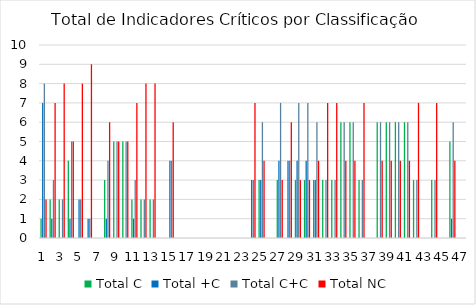
| Category | Total C | Total +C | Total C+C | Total NC |
|---|---|---|---|---|
| 0 | 1 | 7 | 8 | 2 |
| 1 | 2 | 1 | 3 | 7 |
| 2 | 2 | 0 | 2 | 8 |
| 3 | 4 | 1 | 5 | 5 |
| 4 | 0 | 2 | 2 | 8 |
| 5 | 0 | 1 | 1 | 9 |
| 6 | 0 | 0 | 0 | 0 |
| 7 | 3 | 1 | 4 | 6 |
| 8 | 5 | 0 | 5 | 5 |
| 9 | 5 | 0 | 5 | 5 |
| 10 | 2 | 1 | 3 | 7 |
| 11 | 2 | 0 | 2 | 8 |
| 12 | 2 | 0 | 2 | 8 |
| 13 | 0 | 0 | 0 | 0 |
| 14 | 0 | 4 | 4 | 6 |
| 15 | 0 | 0 | 0 | 0 |
| 16 | 0 | 0 | 0 | 0 |
| 17 | 0 | 0 | 0 | 0 |
| 18 | 0 | 0 | 0 | 0 |
| 19 | 0 | 0 | 0 | 0 |
| 20 | 0 | 0 | 0 | 0 |
| 21 | 0 | 0 | 0 | 0 |
| 22 | 0 | 0 | 0 | 0 |
| 23 | 0 | 3 | 3 | 7 |
| 24 | 3 | 3 | 6 | 4 |
| 25 | 0 | 0 | 0 | 0 |
| 26 | 3 | 4 | 7 | 3 |
| 27 | 0 | 4 | 4 | 6 |
| 28 | 3 | 4 | 7 | 3 |
| 29 | 3 | 4 | 7 | 3 |
| 30 | 3 | 3 | 6 | 4 |
| 31 | 3 | 0 | 3 | 7 |
| 32 | 3 | 0 | 3 | 7 |
| 33 | 6 | 0 | 6 | 4 |
| 34 | 6 | 0 | 6 | 4 |
| 35 | 3 | 0 | 3 | 7 |
| 36 | 0 | 0 | 0 | 0 |
| 37 | 6 | 0 | 6 | 4 |
| 38 | 6 | 0 | 6 | 4 |
| 39 | 6 | 0 | 6 | 4 |
| 40 | 6 | 0 | 6 | 4 |
| 41 | 3 | 0 | 3 | 7 |
| 42 | 0 | 0 | 0 | 0 |
| 43 | 3 | 0 | 3 | 7 |
| 44 | 0 | 0 | 0 | 0 |
| 45 | 5 | 1 | 6 | 4 |
| 46 | 0 | 0 | 0 | 0 |